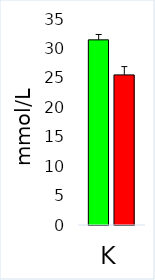
| Category | Control | ASD |
|---|---|---|
| K | 31.458 | 25.502 |